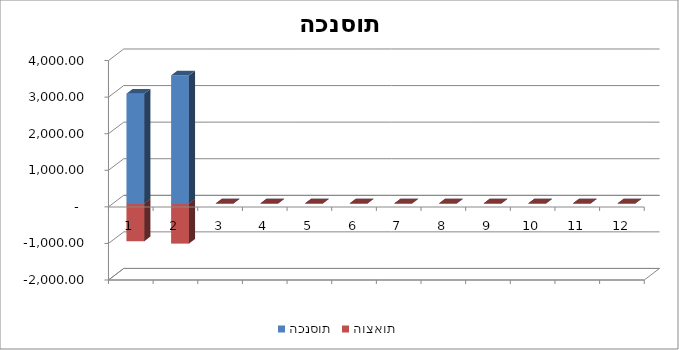
| Category | הכנסות | הוצאות |
|---|---|---|
| 0 | 3000 | -1035 |
| 1 | 3500 | -1100 |
| 2 | 0 | 0 |
| 3 | 0 | 0 |
| 4 | 0 | 0 |
| 5 | 0 | 0 |
| 6 | 0 | 0 |
| 7 | 0 | 0 |
| 8 | 0 | 0 |
| 9 | 0 | 0 |
| 10 | 0 | 0 |
| 11 | 0 | 0 |